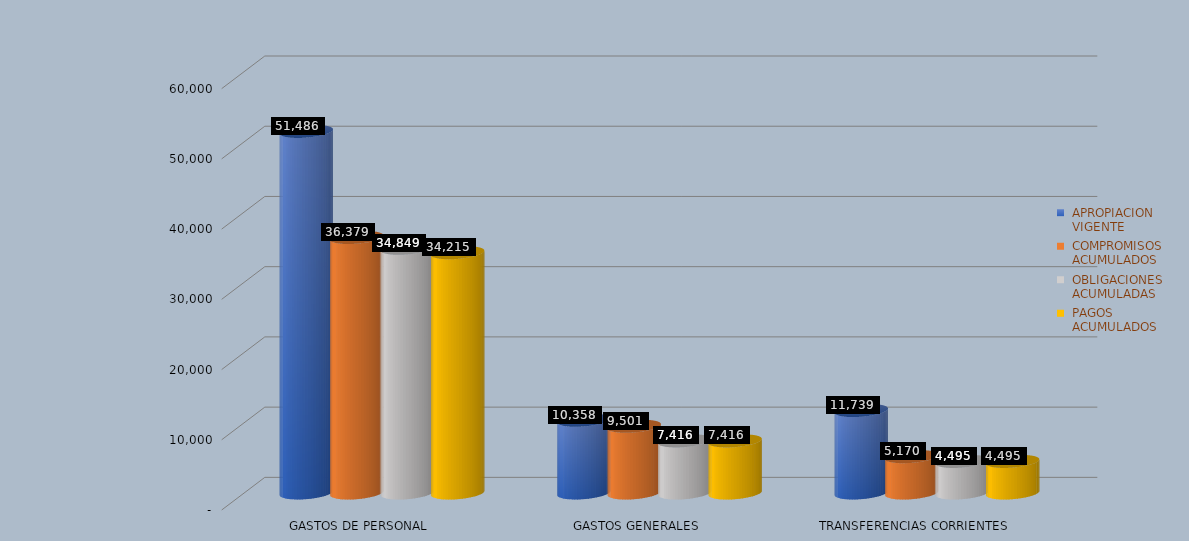
| Category |  APROPIACION
 VIGENTE |  COMPROMISOS
 ACUMULADOS |  OBLIGACIONES
 ACUMULADAS |  PAGOS
 ACUMULADOS |
|---|---|---|---|---|
| GASTOS DE PERSONAL | 51485.706 | 36378.64 | 34848.762 | 34215.227 |
| GASTOS GENERALES | 10357.915 | 9500.787 | 7416.14 | 7416.14 |
| TRANSFERENCIAS CORRIENTES | 11739.403 | 5170.255 | 4494.732 | 4494.732 |